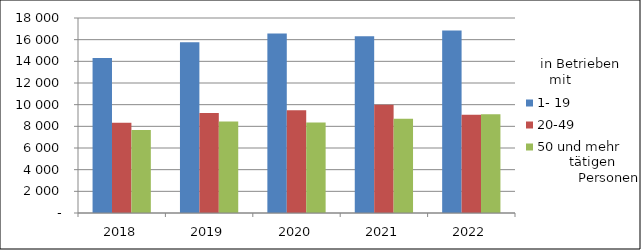
| Category | 1- 19 | 20-49 | 50 und mehr |
|---|---|---|---|
| 2018.0 | 14315 | 8321 | 7663 |
| 2019.0 | 15756 | 9231 | 8442 |
| 2020.0 | 16578 | 9495 | 8365 |
| 2021.0 | 16314 | 9999 | 8709 |
| 2022.0 | 16848 | 9064 | 9117 |